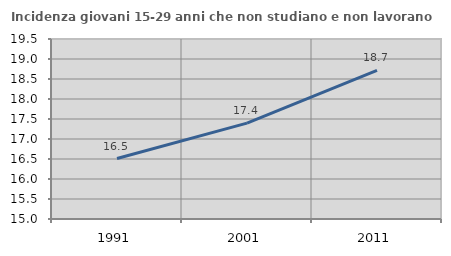
| Category | Incidenza giovani 15-29 anni che non studiano e non lavorano  |
|---|---|
| 1991.0 | 16.511 |
| 2001.0 | 17.397 |
| 2011.0 | 18.717 |